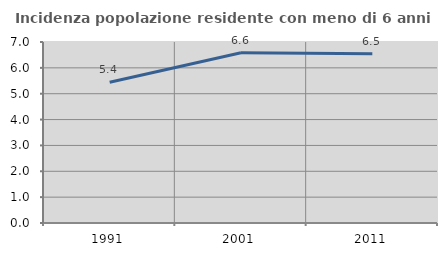
| Category | Incidenza popolazione residente con meno di 6 anni |
|---|---|
| 1991.0 | 5.441 |
| 2001.0 | 6.587 |
| 2011.0 | 6.545 |